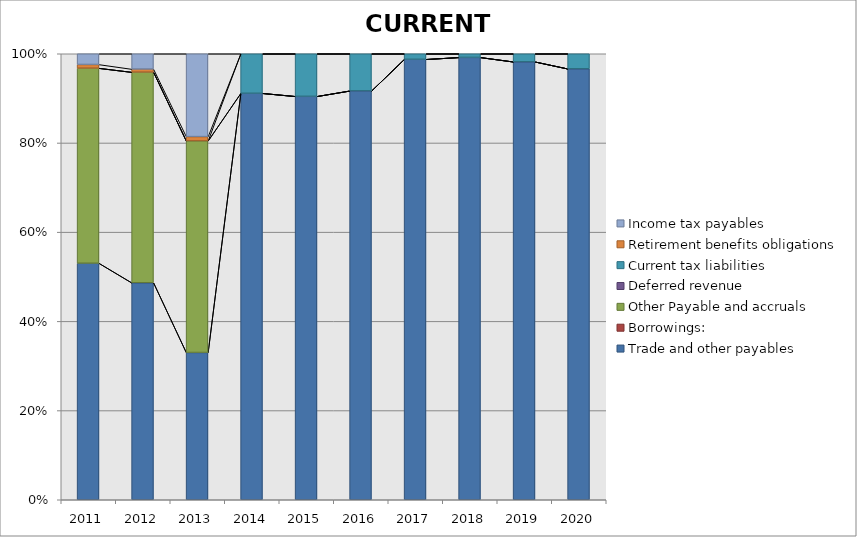
| Category | Trade and other payables | Borrowings: | Other Payable and accruals | Deferred revenue | Current tax liabilities | Retirement benefits obligations | Income tax payables |
|---|---|---|---|---|---|---|---|
| 2011.0 | 4290539 | 0 | 3538628 | 0 | 0 | 66743 | 194632 |
| 2012.0 | 3703319 | 0 | 3594711 | 0 | 0 | 51673 | 262047 |
| 2013.0 | 2921227 | 0 | 4198419 | 0 | 0 | 84600 | 1643450 |
| 2014.0 | 9008713 | 0 | 0 | 0 | 875616 | 0 | 0 |
| 2015.0 | 10427315 | 0 | 0 | 0 | 1099724 | 0 | 0 |
| 2016.0 | 10982227 | 0 | 0 | 0 | 995305 | 0 | 0 |
| 2017.0 | 10092515 | 0 | 0 | 0 | 126521 | 0 | 0 |
| 2018.0 | 7938413 | 0 | 0 | 0 | 64943 | 0 | 0 |
| 2019.0 | 9542967 | 0 | 0 | 0 | 174532 | 0 | 0 |
| 2020.0 | 9085578 | 0 | 0 | 0 | 316429 | 0 | 0 |